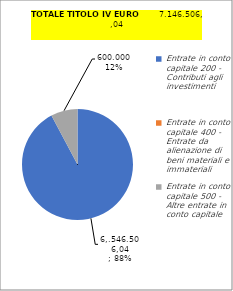
| Category |  6.546.506,04  | Series 0 |
|---|---|---|
| 0 | 7115302.4 | 14090038.98 |
| 1 | 0 | 4492996 |
| 2 | 600000 | 600000 |